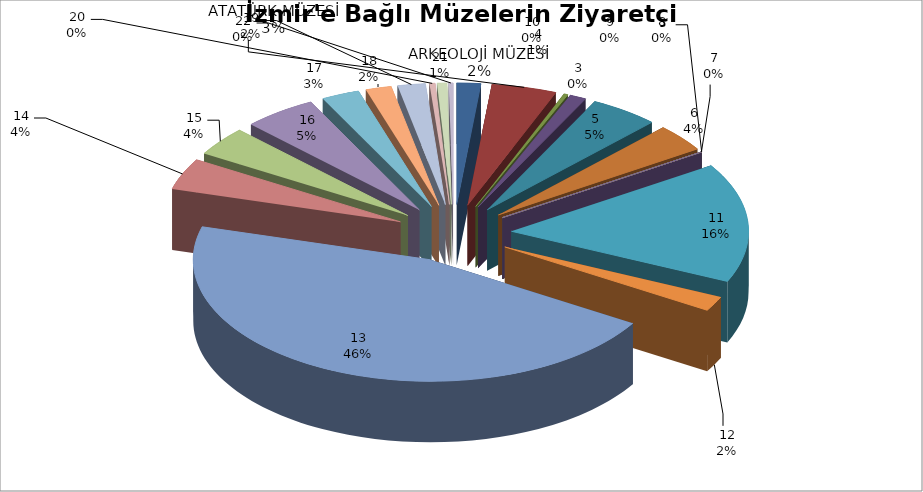
| Category | Series 0 |
|---|---|
| 0 | 27964 |
| 1 | 75930 |
| 2 | 4871 |
| 3 | 19414 |
| 4 | 80877 |
| 5 | 62411 |
| 6 | 748 |
| 7 | 0 |
| 8 | 0 |
| 9 | 0 |
| 10 | 272215 |
| 11 | 33482 |
| 12 | 782027 |
| 13 | 71266 |
| 14 | 66575 |
| 15 | 85704 |
| 16 | 44325 |
| 17 | 30020 |
| 18 | 32253 |
| 19 | 6518 |
| 20 | 11467 |
| 21 | 5073 |